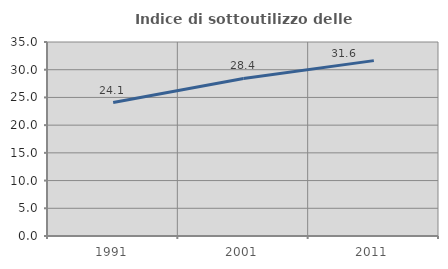
| Category | Indice di sottoutilizzo delle abitazioni  |
|---|---|
| 1991.0 | 24.08 |
| 2001.0 | 28.423 |
| 2011.0 | 31.639 |